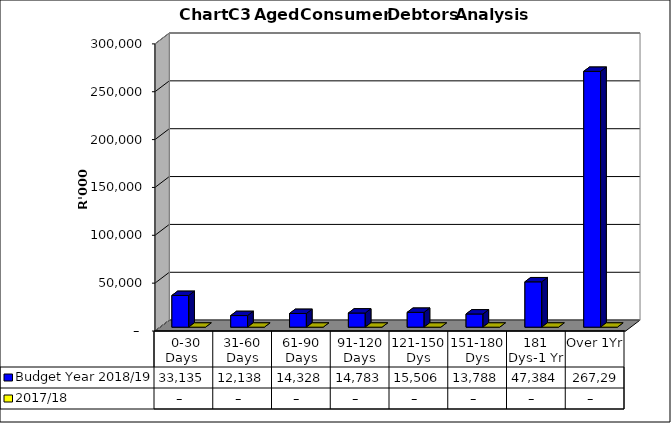
| Category | Budget Year 2018/19 | 2017/18 |
|---|---|---|
|  0-30 Days  | 33135131 | 0 |
| 31-60 Days | 12137842 | 0 |
| 61-90 Days | 14328359 | 0 |
| 91-120 Days | 14782549 | 0 |
| 121-150 Dys | 15505799 | 0 |
| 151-180 Dys | 13787983 | 0 |
| 181 Dys-1 Yr | 47383938 | 0 |
| Over 1Yr | 267296653 | 0 |